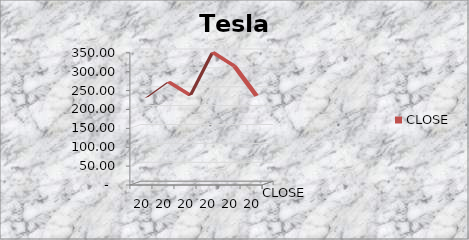
| Category | CLOSE |
|---|---|
| 2014.0 | 223.57 |
| 2015.0 | 265.41 |
| 2016.0 | 229.51 |
| 2017.0 | 343.85 |
| 2018.0 | 306.65 |
| 2019.0 | 228.04 |